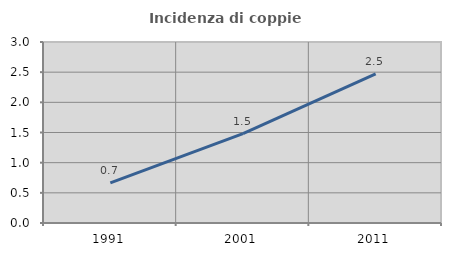
| Category | Incidenza di coppie miste |
|---|---|
| 1991.0 | 0.665 |
| 2001.0 | 1.481 |
| 2011.0 | 2.471 |